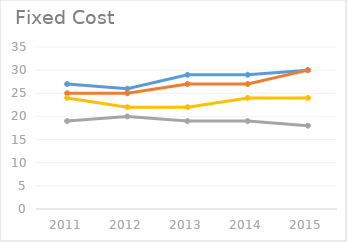
| Category | ACC Ltd | Ambuja Cement | JK Lakshmi Cement | Ultratech Cement |
|---|---|---|---|---|
| 2011 | 27 | 25 | 19 | 24 |
| 2012 | 26 | 25 | 20 | 22 |
| 2013 | 29 | 27 | 19 | 22 |
| 2014 | 29 | 27 | 19 | 24 |
| 2015 | 30 | 30 | 18 | 24 |